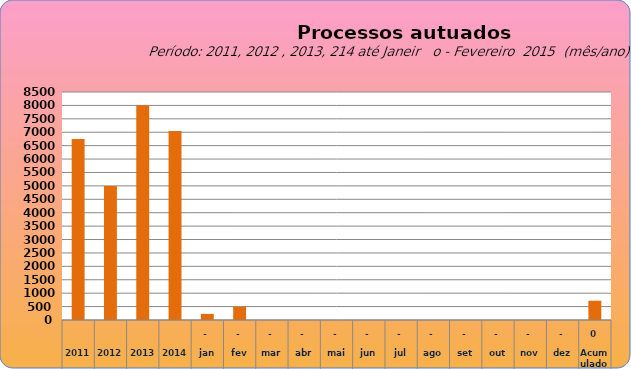
| Category | 6749 4998 8003 7049  228   489   -     -     -     -     -     -     -     -     -     -     717  |
|---|---|
| 2011 | 6749 |
| 2012 | 4998 |
| 2013 | 8003 |
| 2014 | 7049 |
| jan | 228 |
| fev | 491 |
| mar | 0 |
| abr | 0 |
| mai | 0 |
| jun | 0 |
| jul | 0 |
| ago | 0 |
| set | 0 |
| out | 0 |
| nov | 0 |
| dez | 0 |
| Acumulado
 | 719 |